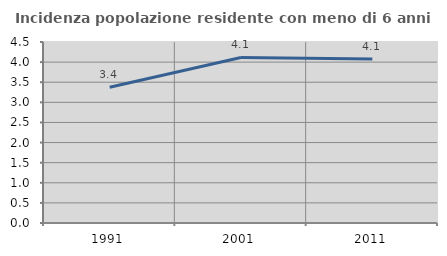
| Category | Incidenza popolazione residente con meno di 6 anni |
|---|---|
| 1991.0 | 3.376 |
| 2001.0 | 4.115 |
| 2011.0 | 4.075 |